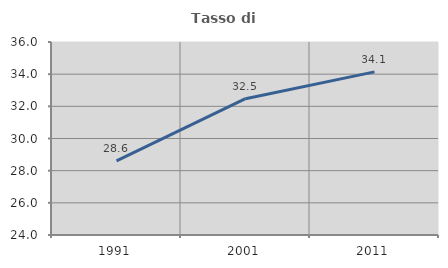
| Category | Tasso di occupazione   |
|---|---|
| 1991.0 | 28.609 |
| 2001.0 | 32.475 |
| 2011.0 | 34.144 |